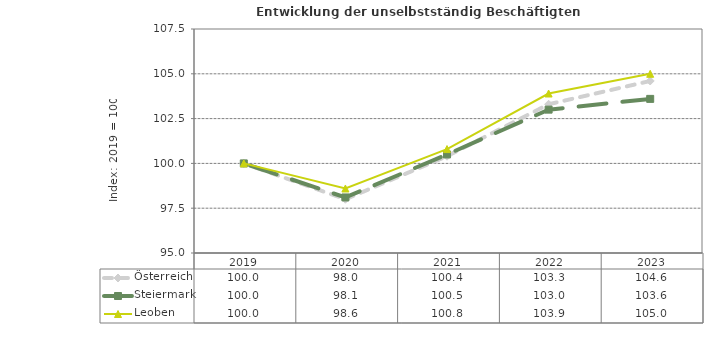
| Category | Österreich | Steiermark | Leoben |
|---|---|---|---|
| 2023.0 | 104.6 | 103.6 | 105 |
| 2022.0 | 103.3 | 103 | 103.9 |
| 2021.0 | 100.4 | 100.5 | 100.8 |
| 2020.0 | 98 | 98.1 | 98.6 |
| 2019.0 | 100 | 100 | 100 |